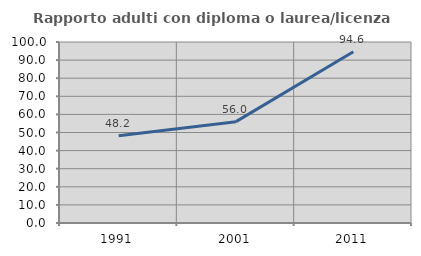
| Category | Rapporto adulti con diploma o laurea/licenza media  |
|---|---|
| 1991.0 | 48.201 |
| 2001.0 | 56 |
| 2011.0 | 94.595 |